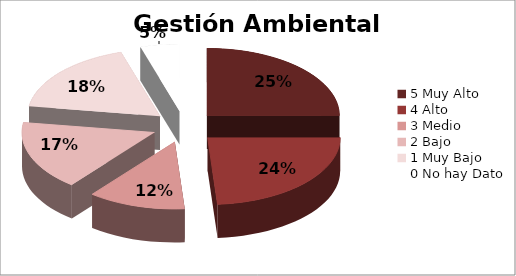
| Category | % Municipios |
|---|---|
| 0 | 0.25 |
| 1 | 0.238 |
| 2 | 0.119 |
| 3 | 0.167 |
| 4 | 0.179 |
| 5 | 0.048 |